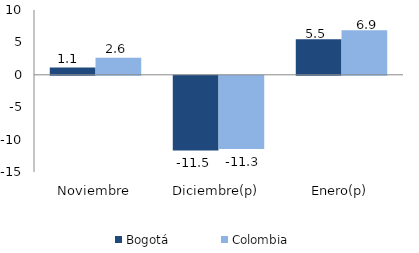
| Category | Bogotá | Colombia |
|---|---|---|
| Noviembre | 1.11 | 2.623 |
| Diciembre(p) | -11.512 | -11.294 |
| Enero(p) | 5.49 | 6.859 |